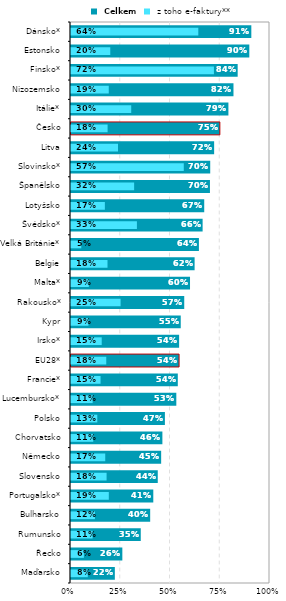
| Category |  Celkem |
|---|---|
| Maďarsko | 0.22 |
| Řecko | 0.258 |
| Rumunsko | 0.351 |
| Bulharsko | 0.398 |
| Portugalsko* | 0.414 |
| Slovensko | 0.436 |
| Německo | 0.453 |
| Chorvatsko | 0.459 |
| Polsko | 0.472 |
| Lucembursko* | 0.529 |
| Francie* | 0.537 |
| EU28* | 0.543 |
| Irsko* | 0.543 |
| Kypr | 0.551 |
| Rakousko* | 0.569 |
| Malta* | 0.598 |
| Belgie | 0.621 |
| Velká Británie* | 0.643 |
| Švédsko* | 0.661 |
| Lotyšsko | 0.669 |
| Španělsko | 0.698 |
| Slovinsko* | 0.7 |
| Litva | 0.719 |
| Česko | 0.748 |
| Itálie* | 0.791 |
| Nizozemsko | 0.816 |
| Finsko* | 0.838 |
| Estonsko | 0.896 |
| Dánsko* | 0.906 |